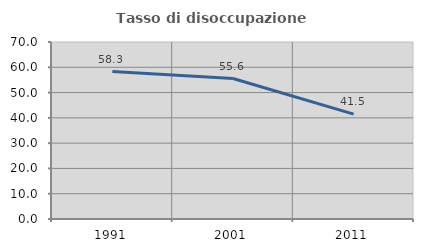
| Category | Tasso di disoccupazione giovanile  |
|---|---|
| 1991.0 | 58.333 |
| 2001.0 | 55.556 |
| 2011.0 | 41.463 |